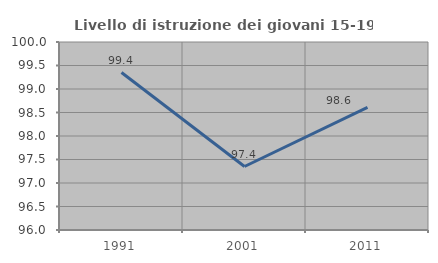
| Category | Livello di istruzione dei giovani 15-19 anni |
|---|---|
| 1991.0 | 99.351 |
| 2001.0 | 97.351 |
| 2011.0 | 98.611 |